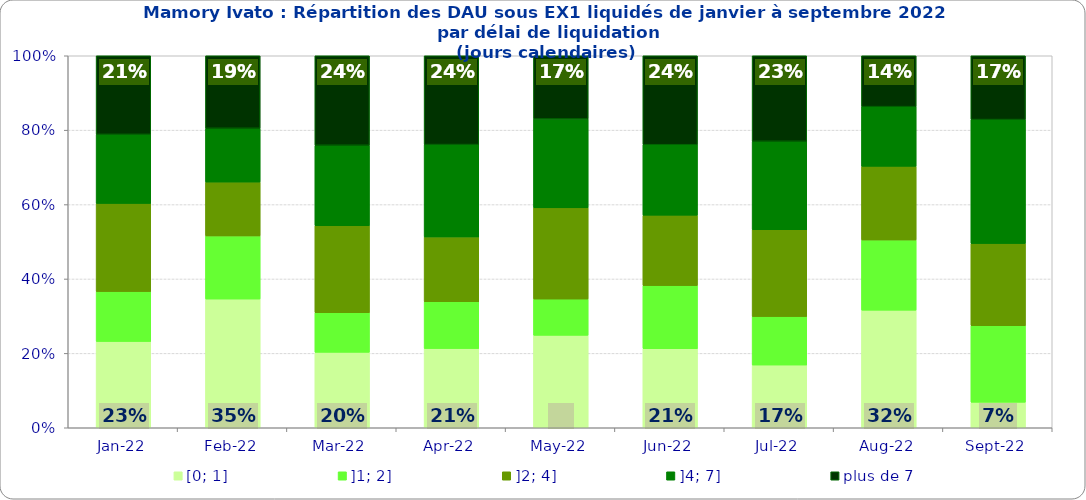
| Category | [0; 1] | ]1; 2] | ]2; 4] | ]4; 7] | plus de 7 |
|---|---|---|---|---|---|
| 2022-01-01 | 0.232 | 0.134 | 0.237 | 0.186 | 0.211 |
| 2022-02-01 | 0.346 | 0.17 | 0.145 | 0.145 | 0.195 |
| 2022-03-01 | 0.203 | 0.107 | 0.234 | 0.216 | 0.241 |
| 2022-04-01 | 0.213 | 0.126 | 0.174 | 0.248 | 0.239 |
| 2022-05-01 | 0.248 | 0.097 | 0.245 | 0.239 | 0.17 |
| 2022-06-01 | 0.213 | 0.169 | 0.189 | 0.189 | 0.239 |
| 2022-07-01 | 0.169 | 0.13 | 0.234 | 0.238 | 0.23 |
| 2022-08-01 | 0.316 | 0.189 | 0.198 | 0.16 | 0.137 |
| 2022-09-01 | 0.069 | 0.206 | 0.221 | 0.333 | 0.172 |